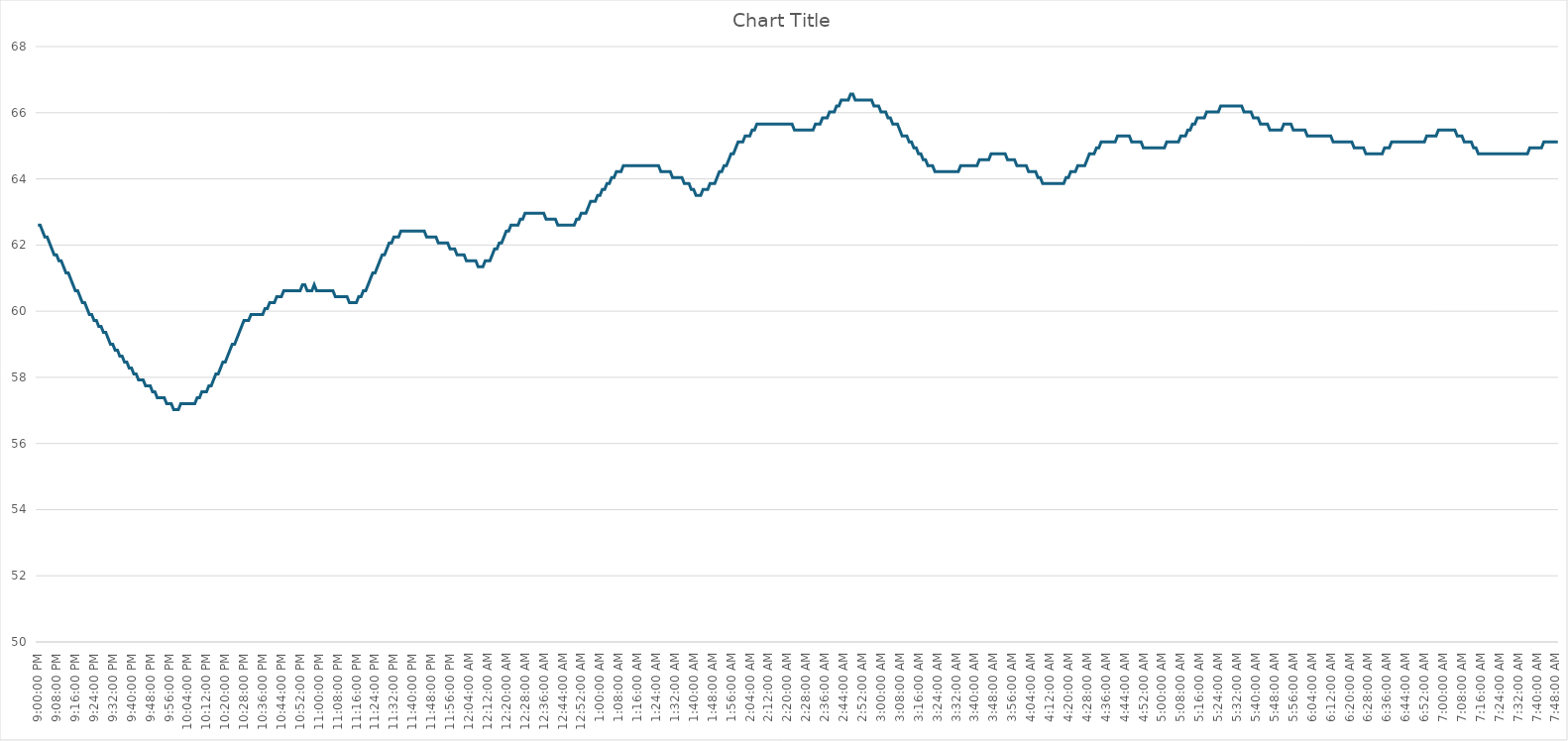
| Category | Series 0 |
|---|---|
| 2024-03-15 21:00:00 | 62.6 |
| 2024-03-15 21:01:00 | 62.6 |
| 2024-03-15 21:02:00 | 62.42 |
| 2024-03-15 21:03:00 | 62.24 |
| 2024-03-15 21:04:00 | 62.24 |
| 2024-03-15 21:05:00 | 62.06 |
| 2024-03-15 21:06:00 | 61.88 |
| 2024-03-15 21:07:00 | 61.7 |
| 2024-03-15 21:08:00 | 61.7 |
| 2024-03-15 21:09:00 | 61.52 |
| 2024-03-15 21:10:00 | 61.52 |
| 2024-03-15 21:11:00 | 61.34 |
| 2024-03-15 21:12:00 | 61.16 |
| 2024-03-15 21:13:00 | 61.16 |
| 2024-03-15 21:14:00 | 60.98 |
| 2024-03-15 21:15:00 | 60.8 |
| 2024-03-15 21:16:00 | 60.62 |
| 2024-03-15 21:17:00 | 60.62 |
| 2024-03-15 21:18:00 | 60.44 |
| 2024-03-15 21:19:00 | 60.26 |
| 2024-03-15 21:20:00 | 60.26 |
| 2024-03-15 21:21:00 | 60.08 |
| 2024-03-15 21:22:00 | 59.9 |
| 2024-03-15 21:23:00 | 59.9 |
| 2024-03-15 21:24:00 | 59.72 |
| 2024-03-15 21:25:00 | 59.72 |
| 2024-03-15 21:26:00 | 59.54 |
| 2024-03-15 21:27:00 | 59.54 |
| 2024-03-15 21:28:00 | 59.36 |
| 2024-03-15 21:29:00 | 59.36 |
| 2024-03-15 21:30:00 | 59.18 |
| 2024-03-15 21:31:00 | 59 |
| 2024-03-15 21:32:00 | 59 |
| 2024-03-15 21:33:00 | 58.82 |
| 2024-03-15 21:34:00 | 58.82 |
| 2024-03-15 21:35:00 | 58.64 |
| 2024-03-15 21:36:00 | 58.64 |
| 2024-03-15 21:37:00 | 58.46 |
| 2024-03-15 21:38:00 | 58.46 |
| 2024-03-15 21:39:00 | 58.28 |
| 2024-03-15 21:40:00 | 58.28 |
| 2024-03-15 21:41:00 | 58.1 |
| 2024-03-15 21:42:00 | 58.1 |
| 2024-03-15 21:43:00 | 57.92 |
| 2024-03-15 21:44:00 | 57.92 |
| 2024-03-15 21:45:00 | 57.92 |
| 2024-03-15 21:46:00 | 57.74 |
| 2024-03-15 21:47:00 | 57.74 |
| 2024-03-15 21:48:00 | 57.74 |
| 2024-03-15 21:49:00 | 57.56 |
| 2024-03-15 21:50:00 | 57.56 |
| 2024-03-15 21:51:00 | 57.38 |
| 2024-03-15 21:52:00 | 57.38 |
| 2024-03-15 21:53:00 | 57.38 |
| 2024-03-15 21:54:00 | 57.38 |
| 2024-03-15 21:55:00 | 57.2 |
| 2024-03-15 21:56:00 | 57.2 |
| 2024-03-15 21:57:00 | 57.2 |
| 2024-03-15 21:58:00 | 57.02 |
| 2024-03-15 21:59:00 | 57.02 |
| 2024-03-15 22:00:00 | 57.02 |
| 2024-03-15 22:01:00 | 57.2 |
| 2024-03-15 22:02:00 | 57.2 |
| 2024-03-15 22:03:00 | 57.2 |
| 2024-03-15 22:04:00 | 57.2 |
| 2024-03-15 22:05:00 | 57.2 |
| 2024-03-15 22:06:00 | 57.2 |
| 2024-03-15 22:07:00 | 57.2 |
| 2024-03-15 22:08:00 | 57.38 |
| 2024-03-15 22:09:00 | 57.38 |
| 2024-03-15 22:10:00 | 57.56 |
| 2024-03-15 22:11:00 | 57.56 |
| 2024-03-15 22:12:00 | 57.56 |
| 2024-03-15 22:13:00 | 57.74 |
| 2024-03-15 22:14:00 | 57.74 |
| 2024-03-15 22:15:00 | 57.92 |
| 2024-03-15 22:16:00 | 58.1 |
| 2024-03-15 22:17:00 | 58.1 |
| 2024-03-15 22:18:00 | 58.28 |
| 2024-03-15 22:19:00 | 58.46 |
| 2024-03-15 22:20:00 | 58.46 |
| 2024-03-15 22:21:00 | 58.64 |
| 2024-03-15 22:22:00 | 58.82 |
| 2024-03-15 22:23:00 | 59 |
| 2024-03-15 22:24:00 | 59 |
| 2024-03-15 22:25:00 | 59.18 |
| 2024-03-15 22:26:00 | 59.36 |
| 2024-03-15 22:27:00 | 59.54 |
| 2024-03-15 22:28:00 | 59.72 |
| 2024-03-15 22:29:00 | 59.72 |
| 2024-03-15 22:30:00 | 59.72 |
| 2024-03-15 22:31:00 | 59.9 |
| 2024-03-15 22:32:00 | 59.9 |
| 2024-03-15 22:33:00 | 59.9 |
| 2024-03-15 22:34:00 | 59.9 |
| 2024-03-15 22:35:00 | 59.9 |
| 2024-03-15 22:36:00 | 59.9 |
| 2024-03-15 22:37:00 | 60.08 |
| 2024-03-15 22:38:00 | 60.08 |
| 2024-03-15 22:39:00 | 60.26 |
| 2024-03-15 22:40:00 | 60.26 |
| 2024-03-15 22:41:00 | 60.26 |
| 2024-03-15 22:42:00 | 60.44 |
| 2024-03-15 22:43:00 | 60.44 |
| 2024-03-15 22:44:00 | 60.44 |
| 2024-03-15 22:45:00 | 60.62 |
| 2024-03-15 22:46:00 | 60.62 |
| 2024-03-15 22:47:00 | 60.62 |
| 2024-03-15 22:48:00 | 60.62 |
| 2024-03-15 22:49:00 | 60.62 |
| 2024-03-15 22:50:00 | 60.62 |
| 2024-03-15 22:51:00 | 60.62 |
| 2024-03-15 22:52:00 | 60.62 |
| 2024-03-15 22:53:00 | 60.8 |
| 2024-03-15 22:54:00 | 60.8 |
| 2024-03-15 22:55:00 | 60.62 |
| 2024-03-15 22:56:00 | 60.62 |
| 2024-03-15 22:57:00 | 60.62 |
| 2024-03-15 22:58:00 | 60.8 |
| 2024-03-15 22:59:00 | 60.62 |
| 2024-03-15 23:00:00 | 60.62 |
| 2024-03-15 23:01:00 | 60.62 |
| 2024-03-15 23:02:00 | 60.62 |
| 2024-03-15 23:03:00 | 60.62 |
| 2024-03-15 23:04:00 | 60.62 |
| 2024-03-15 23:05:00 | 60.62 |
| 2024-03-15 23:06:00 | 60.62 |
| 2024-03-15 23:07:00 | 60.44 |
| 2024-03-15 23:08:00 | 60.44 |
| 2024-03-15 23:09:00 | 60.44 |
| 2024-03-15 23:10:00 | 60.44 |
| 2024-03-15 23:11:00 | 60.44 |
| 2024-03-15 23:12:00 | 60.44 |
| 2024-03-15 23:13:00 | 60.26 |
| 2024-03-15 23:14:00 | 60.26 |
| 2024-03-15 23:15:00 | 60.26 |
| 2024-03-15 23:16:00 | 60.26 |
| 2024-03-15 23:17:00 | 60.44 |
| 2024-03-15 23:18:00 | 60.44 |
| 2024-03-15 23:19:00 | 60.62 |
| 2024-03-15 23:20:00 | 60.62 |
| 2024-03-15 23:21:00 | 60.8 |
| 2024-03-15 23:22:00 | 60.98 |
| 2024-03-15 23:23:00 | 61.16 |
| 2024-03-15 23:24:00 | 61.16 |
| 2024-03-15 23:25:00 | 61.34 |
| 2024-03-15 23:26:00 | 61.52 |
| 2024-03-15 23:27:00 | 61.7 |
| 2024-03-15 23:28:00 | 61.7 |
| 2024-03-15 23:29:00 | 61.88 |
| 2024-03-15 23:30:00 | 62.06 |
| 2024-03-15 23:31:00 | 62.06 |
| 2024-03-15 23:32:00 | 62.24 |
| 2024-03-15 23:33:00 | 62.24 |
| 2024-03-15 23:34:00 | 62.24 |
| 2024-03-15 23:35:00 | 62.42 |
| 2024-03-15 23:36:00 | 62.42 |
| 2024-03-15 23:37:00 | 62.42 |
| 2024-03-15 23:38:00 | 62.42 |
| 2024-03-15 23:39:00 | 62.42 |
| 2024-03-15 23:40:00 | 62.42 |
| 2024-03-15 23:41:00 | 62.42 |
| 2024-03-15 23:42:00 | 62.42 |
| 2024-03-15 23:43:00 | 62.42 |
| 2024-03-15 23:44:00 | 62.42 |
| 2024-03-15 23:45:00 | 62.42 |
| 2024-03-15 23:46:00 | 62.24 |
| 2024-03-15 23:47:00 | 62.24 |
| 2024-03-15 23:48:00 | 62.24 |
| 2024-03-15 23:49:00 | 62.24 |
| 2024-03-15 23:50:00 | 62.24 |
| 2024-03-15 23:51:00 | 62.06 |
| 2024-03-15 23:52:00 | 62.06 |
| 2024-03-15 23:53:00 | 62.06 |
| 2024-03-15 23:54:00 | 62.06 |
| 2024-03-15 23:55:00 | 62.06 |
| 2024-03-15 23:56:00 | 61.88 |
| 2024-03-15 23:57:00 | 61.88 |
| 2024-03-15 23:58:00 | 61.88 |
| 2024-03-15 23:59:00 | 61.7 |
| 2024-03-16 | 61.7 |
| 2024-03-16 00:01:00 | 61.7 |
| 2024-03-16 00:02:00 | 61.7 |
| 2024-03-16 00:03:00 | 61.52 |
| 2024-03-16 00:04:00 | 61.52 |
| 2024-03-16 00:05:00 | 61.52 |
| 2024-03-16 00:06:00 | 61.52 |
| 2024-03-16 00:07:00 | 61.52 |
| 2024-03-16 00:08:00 | 61.34 |
| 2024-03-16 00:09:00 | 61.34 |
| 2024-03-16 00:10:00 | 61.34 |
| 2024-03-16 00:11:00 | 61.52 |
| 2024-03-16 00:12:00 | 61.52 |
| 2024-03-16 00:13:00 | 61.52 |
| 2024-03-16 00:14:00 | 61.7 |
| 2024-03-16 00:15:00 | 61.88 |
| 2024-03-16 00:16:00 | 61.88 |
| 2024-03-16 00:17:00 | 62.06 |
| 2024-03-16 00:18:00 | 62.06 |
| 2024-03-16 00:19:00 | 62.24 |
| 2024-03-16 00:20:00 | 62.42 |
| 2024-03-16 00:21:00 | 62.42 |
| 2024-03-16 00:22:00 | 62.6 |
| 2024-03-16 00:23:00 | 62.6 |
| 2024-03-16 00:24:00 | 62.6 |
| 2024-03-16 00:25:00 | 62.6 |
| 2024-03-16 00:26:00 | 62.78 |
| 2024-03-16 00:27:00 | 62.78 |
| 2024-03-16 00:28:00 | 62.96 |
| 2024-03-16 00:29:00 | 62.96 |
| 2024-03-16 00:30:00 | 62.96 |
| 2024-03-16 00:31:00 | 62.96 |
| 2024-03-16 00:32:00 | 62.96 |
| 2024-03-16 00:33:00 | 62.96 |
| 2024-03-16 00:34:00 | 62.96 |
| 2024-03-16 00:35:00 | 62.96 |
| 2024-03-16 00:36:00 | 62.96 |
| 2024-03-16 00:37:00 | 62.78 |
| 2024-03-16 00:38:00 | 62.78 |
| 2024-03-16 00:39:00 | 62.78 |
| 2024-03-16 00:40:00 | 62.78 |
| 2024-03-16 00:41:00 | 62.78 |
| 2024-03-16 00:42:00 | 62.6 |
| 2024-03-16 00:43:00 | 62.6 |
| 2024-03-16 00:44:00 | 62.6 |
| 2024-03-16 00:45:00 | 62.6 |
| 2024-03-16 00:46:00 | 62.6 |
| 2024-03-16 00:47:00 | 62.6 |
| 2024-03-16 00:48:00 | 62.6 |
| 2024-03-16 00:49:00 | 62.6 |
| 2024-03-16 00:50:00 | 62.78 |
| 2024-03-16 00:51:00 | 62.78 |
| 2024-03-16 00:52:00 | 62.96 |
| 2024-03-16 00:53:00 | 62.96 |
| 2024-03-16 00:54:00 | 62.96 |
| 2024-03-16 00:55:00 | 63.14 |
| 2024-03-16 00:56:00 | 63.32 |
| 2024-03-16 00:57:00 | 63.32 |
| 2024-03-16 00:58:00 | 63.32 |
| 2024-03-16 00:59:00 | 63.5 |
| 2024-03-16 01:00:00 | 63.5 |
| 2024-03-16 01:01:00 | 63.68 |
| 2024-03-16 01:02:00 | 63.68 |
| 2024-03-16 01:03:00 | 63.86 |
| 2024-03-16 01:04:00 | 63.86 |
| 2024-03-16 01:05:00 | 64.04 |
| 2024-03-16 01:06:00 | 64.04 |
| 2024-03-16 01:07:00 | 64.22 |
| 2024-03-16 01:08:00 | 64.22 |
| 2024-03-16 01:09:00 | 64.22 |
| 2024-03-16 01:10:00 | 64.4 |
| 2024-03-16 01:11:00 | 64.4 |
| 2024-03-16 01:12:00 | 64.4 |
| 2024-03-16 01:13:00 | 64.4 |
| 2024-03-16 01:14:00 | 64.4 |
| 2024-03-16 01:15:00 | 64.4 |
| 2024-03-16 01:16:00 | 64.4 |
| 2024-03-16 01:17:00 | 64.4 |
| 2024-03-16 01:18:00 | 64.4 |
| 2024-03-16 01:19:00 | 64.4 |
| 2024-03-16 01:20:00 | 64.4 |
| 2024-03-16 01:21:00 | 64.4 |
| 2024-03-16 01:22:00 | 64.4 |
| 2024-03-16 01:23:00 | 64.4 |
| 2024-03-16 01:24:00 | 64.4 |
| 2024-03-16 01:25:00 | 64.4 |
| 2024-03-16 01:26:00 | 64.22 |
| 2024-03-16 01:27:00 | 64.22 |
| 2024-03-16 01:28:00 | 64.22 |
| 2024-03-16 01:29:00 | 64.22 |
| 2024-03-16 01:30:00 | 64.22 |
| 2024-03-16 01:31:00 | 64.04 |
| 2024-03-16 01:32:00 | 64.04 |
| 2024-03-16 01:33:00 | 64.04 |
| 2024-03-16 01:34:00 | 64.04 |
| 2024-03-16 01:35:00 | 64.04 |
| 2024-03-16 01:36:00 | 63.86 |
| 2024-03-16 01:37:00 | 63.86 |
| 2024-03-16 01:38:00 | 63.86 |
| 2024-03-16 01:39:00 | 63.68 |
| 2024-03-16 01:40:00 | 63.68 |
| 2024-03-16 01:41:00 | 63.5 |
| 2024-03-16 01:42:00 | 63.5 |
| 2024-03-16 01:43:00 | 63.5 |
| 2024-03-16 01:44:00 | 63.68 |
| 2024-03-16 01:45:00 | 63.68 |
| 2024-03-16 01:46:00 | 63.68 |
| 2024-03-16 01:47:00 | 63.86 |
| 2024-03-16 01:48:00 | 63.86 |
| 2024-03-16 01:49:00 | 63.86 |
| 2024-03-16 01:50:00 | 64.04 |
| 2024-03-16 01:51:00 | 64.22 |
| 2024-03-16 01:52:00 | 64.22 |
| 2024-03-16 01:53:00 | 64.4 |
| 2024-03-16 01:54:00 | 64.4 |
| 2024-03-16 01:55:00 | 64.58 |
| 2024-03-16 01:56:00 | 64.76 |
| 2024-03-16 01:57:00 | 64.76 |
| 2024-03-16 01:58:00 | 64.94 |
| 2024-03-16 01:59:00 | 65.12 |
| 2024-03-16 02:00:00 | 65.12 |
| 2024-03-16 02:01:00 | 65.12 |
| 2024-03-16 02:02:00 | 65.3 |
| 2024-03-16 02:03:00 | 65.3 |
| 2024-03-16 02:04:00 | 65.3 |
| 2024-03-16 02:05:00 | 65.48 |
| 2024-03-16 02:06:00 | 65.48 |
| 2024-03-16 02:07:00 | 65.66 |
| 2024-03-16 02:08:00 | 65.66 |
| 2024-03-16 02:09:00 | 65.66 |
| 2024-03-16 02:10:00 | 65.66 |
| 2024-03-16 02:11:00 | 65.66 |
| 2024-03-16 02:12:00 | 65.66 |
| 2024-03-16 02:13:00 | 65.66 |
| 2024-03-16 02:14:00 | 65.66 |
| 2024-03-16 02:15:00 | 65.66 |
| 2024-03-16 02:16:00 | 65.66 |
| 2024-03-16 02:17:00 | 65.66 |
| 2024-03-16 02:18:00 | 65.66 |
| 2024-03-16 02:19:00 | 65.66 |
| 2024-03-16 02:20:00 | 65.66 |
| 2024-03-16 02:21:00 | 65.66 |
| 2024-03-16 02:22:00 | 65.66 |
| 2024-03-16 02:23:00 | 65.48 |
| 2024-03-16 02:24:00 | 65.48 |
| 2024-03-16 02:25:00 | 65.48 |
| 2024-03-16 02:26:00 | 65.48 |
| 2024-03-16 02:27:00 | 65.48 |
| 2024-03-16 02:28:00 | 65.48 |
| 2024-03-16 02:29:00 | 65.48 |
| 2024-03-16 02:30:00 | 65.48 |
| 2024-03-16 02:31:00 | 65.48 |
| 2024-03-16 02:32:00 | 65.66 |
| 2024-03-16 02:33:00 | 65.66 |
| 2024-03-16 02:34:00 | 65.66 |
| 2024-03-16 02:35:00 | 65.84 |
| 2024-03-16 02:36:00 | 65.84 |
| 2024-03-16 02:37:00 | 65.84 |
| 2024-03-16 02:38:00 | 66.02 |
| 2024-03-16 02:39:00 | 66.02 |
| 2024-03-16 02:40:00 | 66.02 |
| 2024-03-16 02:41:00 | 66.2 |
| 2024-03-16 02:42:00 | 66.2 |
| 2024-03-16 02:43:00 | 66.38 |
| 2024-03-16 02:44:00 | 66.38 |
| 2024-03-16 02:45:00 | 66.38 |
| 2024-03-16 02:46:00 | 66.38 |
| 2024-03-16 02:47:00 | 66.56 |
| 2024-03-16 02:48:00 | 66.56 |
| 2024-03-16 02:49:00 | 66.38 |
| 2024-03-16 02:50:00 | 66.38 |
| 2024-03-16 02:51:00 | 66.38 |
| 2024-03-16 02:52:00 | 66.38 |
| 2024-03-16 02:53:00 | 66.38 |
| 2024-03-16 02:54:00 | 66.38 |
| 2024-03-16 02:55:00 | 66.38 |
| 2024-03-16 02:56:00 | 66.38 |
| 2024-03-16 02:57:00 | 66.2 |
| 2024-03-16 02:58:00 | 66.2 |
| 2024-03-16 02:59:00 | 66.2 |
| 2024-03-16 03:00:00 | 66.02 |
| 2024-03-16 03:01:00 | 66.02 |
| 2024-03-16 03:02:00 | 66.02 |
| 2024-03-16 03:03:00 | 65.84 |
| 2024-03-16 03:04:00 | 65.84 |
| 2024-03-16 03:05:00 | 65.66 |
| 2024-03-16 03:06:00 | 65.66 |
| 2024-03-16 03:07:00 | 65.66 |
| 2024-03-16 03:08:00 | 65.48 |
| 2024-03-16 03:09:00 | 65.3 |
| 2024-03-16 03:10:00 | 65.3 |
| 2024-03-16 03:11:00 | 65.3 |
| 2024-03-16 03:12:00 | 65.12 |
| 2024-03-16 03:13:00 | 65.12 |
| 2024-03-16 03:14:00 | 64.94 |
| 2024-03-16 03:15:00 | 64.94 |
| 2024-03-16 03:16:00 | 64.76 |
| 2024-03-16 03:17:00 | 64.76 |
| 2024-03-16 03:18:00 | 64.58 |
| 2024-03-16 03:19:00 | 64.58 |
| 2024-03-16 03:20:00 | 64.4 |
| 2024-03-16 03:21:00 | 64.4 |
| 2024-03-16 03:22:00 | 64.4 |
| 2024-03-16 03:23:00 | 64.22 |
| 2024-03-16 03:24:00 | 64.22 |
| 2024-03-16 03:25:00 | 64.22 |
| 2024-03-16 03:26:00 | 64.22 |
| 2024-03-16 03:27:00 | 64.22 |
| 2024-03-16 03:28:00 | 64.22 |
| 2024-03-16 03:29:00 | 64.22 |
| 2024-03-16 03:30:00 | 64.22 |
| 2024-03-16 03:31:00 | 64.22 |
| 2024-03-16 03:32:00 | 64.22 |
| 2024-03-16 03:33:00 | 64.22 |
| 2024-03-16 03:34:00 | 64.4 |
| 2024-03-16 03:35:00 | 64.4 |
| 2024-03-16 03:36:00 | 64.4 |
| 2024-03-16 03:37:00 | 64.4 |
| 2024-03-16 03:38:00 | 64.4 |
| 2024-03-16 03:39:00 | 64.4 |
| 2024-03-16 03:40:00 | 64.4 |
| 2024-03-16 03:41:00 | 64.4 |
| 2024-03-16 03:42:00 | 64.58 |
| 2024-03-16 03:43:00 | 64.58 |
| 2024-03-16 03:44:00 | 64.58 |
| 2024-03-16 03:45:00 | 64.58 |
| 2024-03-16 03:46:00 | 64.58 |
| 2024-03-16 03:47:00 | 64.76 |
| 2024-03-16 03:48:00 | 64.76 |
| 2024-03-16 03:49:00 | 64.76 |
| 2024-03-16 03:50:00 | 64.76 |
| 2024-03-16 03:51:00 | 64.76 |
| 2024-03-16 03:52:00 | 64.76 |
| 2024-03-16 03:53:00 | 64.76 |
| 2024-03-16 03:54:00 | 64.58 |
| 2024-03-16 03:55:00 | 64.58 |
| 2024-03-16 03:56:00 | 64.58 |
| 2024-03-16 03:57:00 | 64.58 |
| 2024-03-16 03:58:00 | 64.4 |
| 2024-03-16 03:59:00 | 64.4 |
| 2024-03-16 04:00:00 | 64.4 |
| 2024-03-16 04:01:00 | 64.4 |
| 2024-03-16 04:02:00 | 64.4 |
| 2024-03-16 04:03:00 | 64.22 |
| 2024-03-16 04:04:00 | 64.22 |
| 2024-03-16 04:05:00 | 64.22 |
| 2024-03-16 04:06:00 | 64.22 |
| 2024-03-16 04:07:00 | 64.04 |
| 2024-03-16 04:08:00 | 64.04 |
| 2024-03-16 04:09:00 | 63.86 |
| 2024-03-16 04:10:00 | 63.86 |
| 2024-03-16 04:11:00 | 63.86 |
| 2024-03-16 04:12:00 | 63.86 |
| 2024-03-16 04:13:00 | 63.86 |
| 2024-03-16 04:14:00 | 63.86 |
| 2024-03-16 04:15:00 | 63.86 |
| 2024-03-16 04:16:00 | 63.86 |
| 2024-03-16 04:17:00 | 63.86 |
| 2024-03-16 04:18:00 | 63.86 |
| 2024-03-16 04:19:00 | 64.04 |
| 2024-03-16 04:20:00 | 64.04 |
| 2024-03-16 04:21:00 | 64.22 |
| 2024-03-16 04:22:00 | 64.22 |
| 2024-03-16 04:23:00 | 64.22 |
| 2024-03-16 04:24:00 | 64.4 |
| 2024-03-16 04:25:00 | 64.4 |
| 2024-03-16 04:26:00 | 64.4 |
| 2024-03-16 04:27:00 | 64.4 |
| 2024-03-16 04:28:00 | 64.58 |
| 2024-03-16 04:29:00 | 64.76 |
| 2024-03-16 04:30:00 | 64.76 |
| 2024-03-16 04:31:00 | 64.76 |
| 2024-03-16 04:32:00 | 64.94 |
| 2024-03-16 04:33:00 | 64.94 |
| 2024-03-16 04:34:00 | 65.12 |
| 2024-03-16 04:35:00 | 65.12 |
| 2024-03-16 04:36:00 | 65.12 |
| 2024-03-16 04:37:00 | 65.12 |
| 2024-03-16 04:38:00 | 65.12 |
| 2024-03-16 04:39:00 | 65.12 |
| 2024-03-16 04:40:00 | 65.12 |
| 2024-03-16 04:41:00 | 65.3 |
| 2024-03-16 04:42:00 | 65.3 |
| 2024-03-16 04:43:00 | 65.3 |
| 2024-03-16 04:44:00 | 65.3 |
| 2024-03-16 04:45:00 | 65.3 |
| 2024-03-16 04:46:00 | 65.3 |
| 2024-03-16 04:47:00 | 65.12 |
| 2024-03-16 04:48:00 | 65.12 |
| 2024-03-16 04:49:00 | 65.12 |
| 2024-03-16 04:50:00 | 65.12 |
| 2024-03-16 04:51:00 | 65.12 |
| 2024-03-16 04:52:00 | 64.94 |
| 2024-03-16 04:53:00 | 64.94 |
| 2024-03-16 04:54:00 | 64.94 |
| 2024-03-16 04:55:00 | 64.94 |
| 2024-03-16 04:56:00 | 64.94 |
| 2024-03-16 04:57:00 | 64.94 |
| 2024-03-16 04:58:00 | 64.94 |
| 2024-03-16 04:59:00 | 64.94 |
| 2024-03-16 05:00:00 | 64.94 |
| 2024-03-16 05:01:00 | 64.94 |
| 2024-03-16 05:02:00 | 65.12 |
| 2024-03-16 05:03:00 | 65.12 |
| 2024-03-16 05:04:00 | 65.12 |
| 2024-03-16 05:05:00 | 65.12 |
| 2024-03-16 05:06:00 | 65.12 |
| 2024-03-16 05:07:00 | 65.12 |
| 2024-03-16 05:08:00 | 65.3 |
| 2024-03-16 05:09:00 | 65.3 |
| 2024-03-16 05:10:00 | 65.3 |
| 2024-03-16 05:11:00 | 65.48 |
| 2024-03-16 05:12:00 | 65.48 |
| 2024-03-16 05:13:00 | 65.66 |
| 2024-03-16 05:14:00 | 65.66 |
| 2024-03-16 05:15:00 | 65.84 |
| 2024-03-16 05:16:00 | 65.84 |
| 2024-03-16 05:17:00 | 65.84 |
| 2024-03-16 05:18:00 | 65.84 |
| 2024-03-16 05:19:00 | 66.02 |
| 2024-03-16 05:20:00 | 66.02 |
| 2024-03-16 05:21:00 | 66.02 |
| 2024-03-16 05:22:00 | 66.02 |
| 2024-03-16 05:23:00 | 66.02 |
| 2024-03-16 05:24:00 | 66.02 |
| 2024-03-16 05:25:00 | 66.2 |
| 2024-03-16 05:26:00 | 66.2 |
| 2024-03-16 05:27:00 | 66.2 |
| 2024-03-16 05:28:00 | 66.2 |
| 2024-03-16 05:29:00 | 66.2 |
| 2024-03-16 05:30:00 | 66.2 |
| 2024-03-16 05:31:00 | 66.2 |
| 2024-03-16 05:32:00 | 66.2 |
| 2024-03-16 05:33:00 | 66.2 |
| 2024-03-16 05:34:00 | 66.2 |
| 2024-03-16 05:35:00 | 66.02 |
| 2024-03-16 05:36:00 | 66.02 |
| 2024-03-16 05:37:00 | 66.02 |
| 2024-03-16 05:38:00 | 66.02 |
| 2024-03-16 05:39:00 | 65.84 |
| 2024-03-16 05:40:00 | 65.84 |
| 2024-03-16 05:41:00 | 65.84 |
| 2024-03-16 05:42:00 | 65.66 |
| 2024-03-16 05:43:00 | 65.66 |
| 2024-03-16 05:44:00 | 65.66 |
| 2024-03-16 05:45:00 | 65.66 |
| 2024-03-16 05:46:00 | 65.48 |
| 2024-03-16 05:47:00 | 65.48 |
| 2024-03-16 05:48:00 | 65.48 |
| 2024-03-16 05:49:00 | 65.48 |
| 2024-03-16 05:50:00 | 65.48 |
| 2024-03-16 05:51:00 | 65.48 |
| 2024-03-16 05:52:00 | 65.66 |
| 2024-03-16 05:53:00 | 65.66 |
| 2024-03-16 05:54:00 | 65.66 |
| 2024-03-16 05:55:00 | 65.66 |
| 2024-03-16 05:56:00 | 65.48 |
| 2024-03-16 05:57:00 | 65.48 |
| 2024-03-16 05:58:00 | 65.48 |
| 2024-03-16 05:59:00 | 65.48 |
| 2024-03-16 06:00:00 | 65.48 |
| 2024-03-16 06:01:00 | 65.48 |
| 2024-03-16 06:02:00 | 65.3 |
| 2024-03-16 06:03:00 | 65.3 |
| 2024-03-16 06:04:00 | 65.3 |
| 2024-03-16 06:05:00 | 65.3 |
| 2024-03-16 06:06:00 | 65.3 |
| 2024-03-16 06:07:00 | 65.3 |
| 2024-03-16 06:08:00 | 65.3 |
| 2024-03-16 06:09:00 | 65.3 |
| 2024-03-16 06:10:00 | 65.3 |
| 2024-03-16 06:11:00 | 65.3 |
| 2024-03-16 06:12:00 | 65.3 |
| 2024-03-16 06:13:00 | 65.12 |
| 2024-03-16 06:14:00 | 65.12 |
| 2024-03-16 06:15:00 | 65.12 |
| 2024-03-16 06:16:00 | 65.12 |
| 2024-03-16 06:17:00 | 65.12 |
| 2024-03-16 06:18:00 | 65.12 |
| 2024-03-16 06:19:00 | 65.12 |
| 2024-03-16 06:20:00 | 65.12 |
| 2024-03-16 06:21:00 | 65.12 |
| 2024-03-16 06:22:00 | 64.94 |
| 2024-03-16 06:23:00 | 64.94 |
| 2024-03-16 06:24:00 | 64.94 |
| 2024-03-16 06:25:00 | 64.94 |
| 2024-03-16 06:26:00 | 64.94 |
| 2024-03-16 06:27:00 | 64.76 |
| 2024-03-16 06:28:00 | 64.76 |
| 2024-03-16 06:29:00 | 64.76 |
| 2024-03-16 06:30:00 | 64.76 |
| 2024-03-16 06:31:00 | 64.76 |
| 2024-03-16 06:32:00 | 64.76 |
| 2024-03-16 06:33:00 | 64.76 |
| 2024-03-16 06:34:00 | 64.76 |
| 2024-03-16 06:35:00 | 64.94 |
| 2024-03-16 06:36:00 | 64.94 |
| 2024-03-16 06:37:00 | 64.94 |
| 2024-03-16 06:38:00 | 65.12 |
| 2024-03-16 06:39:00 | 65.12 |
| 2024-03-16 06:40:00 | 65.12 |
| 2024-03-16 06:41:00 | 65.12 |
| 2024-03-16 06:42:00 | 65.12 |
| 2024-03-16 06:43:00 | 65.12 |
| 2024-03-16 06:44:00 | 65.12 |
| 2024-03-16 06:45:00 | 65.12 |
| 2024-03-16 06:46:00 | 65.12 |
| 2024-03-16 06:47:00 | 65.12 |
| 2024-03-16 06:48:00 | 65.12 |
| 2024-03-16 06:49:00 | 65.12 |
| 2024-03-16 06:50:00 | 65.12 |
| 2024-03-16 06:51:00 | 65.12 |
| 2024-03-16 06:52:00 | 65.12 |
| 2024-03-16 06:53:00 | 65.3 |
| 2024-03-16 06:54:00 | 65.3 |
| 2024-03-16 06:55:00 | 65.3 |
| 2024-03-16 06:56:00 | 65.3 |
| 2024-03-16 06:57:00 | 65.3 |
| 2024-03-16 06:58:00 | 65.48 |
| 2024-03-16 06:59:00 | 65.48 |
| 2024-03-16 07:00:00 | 65.48 |
| 2024-03-16 07:01:00 | 65.48 |
| 2024-03-16 07:02:00 | 65.48 |
| 2024-03-16 07:03:00 | 65.48 |
| 2024-03-16 07:04:00 | 65.48 |
| 2024-03-16 07:05:00 | 65.48 |
| 2024-03-16 07:06:00 | 65.3 |
| 2024-03-16 07:07:00 | 65.3 |
| 2024-03-16 07:08:00 | 65.3 |
| 2024-03-16 07:09:00 | 65.12 |
| 2024-03-16 07:10:00 | 65.12 |
| 2024-03-16 07:11:00 | 65.12 |
| 2024-03-16 07:12:00 | 65.12 |
| 2024-03-16 07:13:00 | 64.94 |
| 2024-03-16 07:14:00 | 64.94 |
| 2024-03-16 07:15:00 | 64.76 |
| 2024-03-16 07:16:00 | 64.76 |
| 2024-03-16 07:17:00 | 64.76 |
| 2024-03-16 07:18:00 | 64.76 |
| 2024-03-16 07:19:00 | 64.76 |
| 2024-03-16 07:20:00 | 64.76 |
| 2024-03-16 07:21:00 | 64.76 |
| 2024-03-16 07:22:00 | 64.76 |
| 2024-03-16 07:23:00 | 64.76 |
| 2024-03-16 07:24:00 | 64.76 |
| 2024-03-16 07:25:00 | 64.76 |
| 2024-03-16 07:26:00 | 64.76 |
| 2024-03-16 07:27:00 | 64.76 |
| 2024-03-16 07:28:00 | 64.76 |
| 2024-03-16 07:29:00 | 64.76 |
| 2024-03-16 07:30:00 | 64.76 |
| 2024-03-16 07:31:00 | 64.76 |
| 2024-03-16 07:32:00 | 64.76 |
| 2024-03-16 07:33:00 | 64.76 |
| 2024-03-16 07:34:00 | 64.76 |
| 2024-03-16 07:35:00 | 64.76 |
| 2024-03-16 07:36:00 | 64.76 |
| 2024-03-16 07:37:00 | 64.94 |
| 2024-03-16 07:38:00 | 64.94 |
| 2024-03-16 07:39:00 | 64.94 |
| 2024-03-16 07:40:00 | 64.94 |
| 2024-03-16 07:41:00 | 64.94 |
| 2024-03-16 07:42:00 | 64.94 |
| 2024-03-16 07:43:00 | 65.12 |
| 2024-03-16 07:44:00 | 65.12 |
| 2024-03-16 07:45:00 | 65.12 |
| 2024-03-16 07:46:00 | 65.12 |
| 2024-03-16 07:47:00 | 65.12 |
| 2024-03-16 07:48:00 | 65.12 |
| 2024-03-16 07:49:00 | 65.12 |